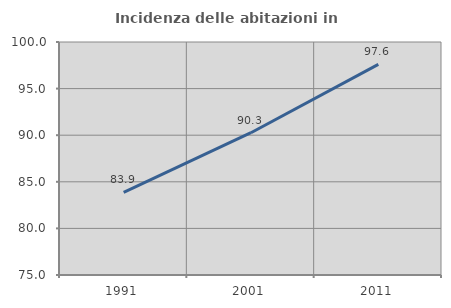
| Category | Incidenza delle abitazioni in proprietà  |
|---|---|
| 1991.0 | 83.871 |
| 2001.0 | 90.265 |
| 2011.0 | 97.6 |